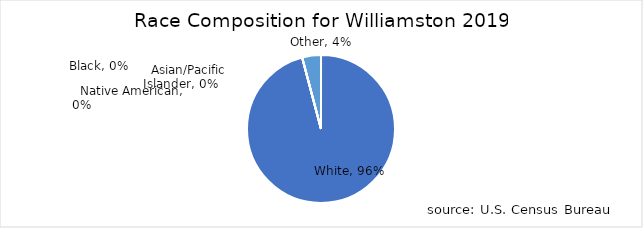
| Category | Series 0 |
|---|---|
|   White | 0.955 |
|   Black | 0 |
|   Asian/Pacific Islander | 0 |
|   Native American | 0 |
|   Other | 0.041 |